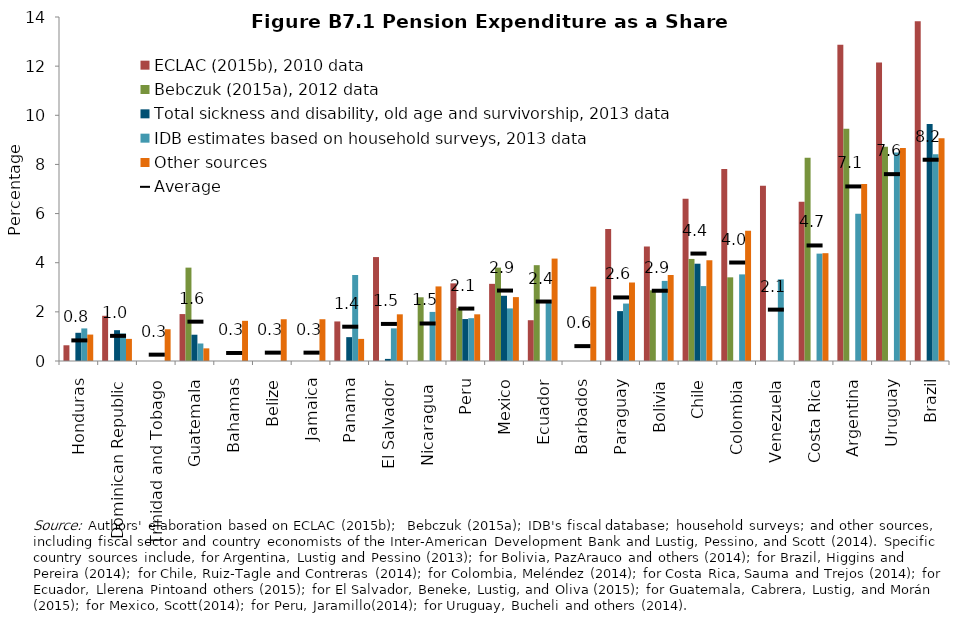
| Category | ECLAC (2015b), 2010 data | Bebczuk (2015a), 2012 data | Total sickness and disability, old age and survivorship, 2013 data | IDB estimates based on household surveys, 2013 data | Other sources |
|---|---|---|---|---|---|
| Honduras | 0.64 | 0 | 1.148 | 1.326 | 1.075 |
| Dominican Republic | 1.84 | 0 | 1.254 | 1.122 | 0.9 |
| Trinidad and Tobago | 0 | 0 | 0 | 0 | 1.292 |
| Guatemala | 1.91 | 3.8 | 1.069 | 0.712 | 0.514 |
| Bahamas | 0 | 0 | 0 | 0 | 1.634 |
| Belize | 0 | 0 | 0 | 0 | 1.7 |
| Jamaica | 0 | 0 | 0 | 0 | 1.7 |
| Panama | 1.61 | 0 | 0.971 | 3.501 | 0.899 |
| El Salvador | 4.23 | 0 | 0.086 | 1.328 | 1.9 |
| Nicaragua | 0 | 2.593 | 0.005 | 1.998 | 3.035 |
| Peru | 3.16 | 2.158 | 1.708 | 1.742 | 1.9 |
| Mexico | 3.14 | 3.8 | 2.655 | 2.14 | 2.6 |
| Ecuador | 1.66 | 3.9 | 0 | 2.371 | 4.168 |
| Barbados | 0 | 0 | 0 | 0 | 3.026 |
| Paraguay | 5.37 | 0 | 2.03 | 2.338 | 3.195 |
| Bolivia | 4.66 | 2.877 | 0 | 3.26 | 3.5 |
| Chile | 6.6 | 4.153 | 3.96 | 3.049 | 4.1 |
| Colombia | 7.81 | 3.405 | 0 | 3.525 | 5.3 |
| Venezuela | 7.13 | 0 | 0 | 3.323 | 0 |
| Costa Rica | 6.48 | 8.273 | 0 | 4.37 | 4.388 |
| Argentina | 12.87 | 9.454 | 0 | 5.997 | 7.2 |
| Uruguay | 12.15 | 8.719 | 0 | 8.485 | 8.669 |
| Brazil | 13.83 | 0 | 9.646 | 8.419 | 9.061 |